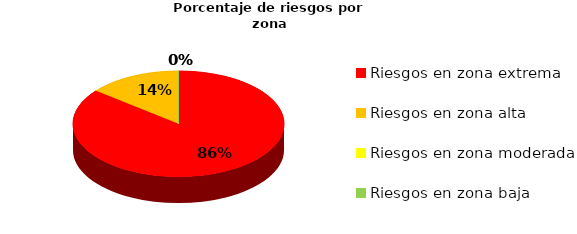
| Category | Series 0 | Series 1 |
|---|---|---|
| Riesgos en zona extrema | 12 | 0.857 |
| Riesgos en zona alta | 2 | 0.143 |
| Riesgos en zona moderada | 0 | 0 |
| Riesgos en zona baja | 0 | 0 |